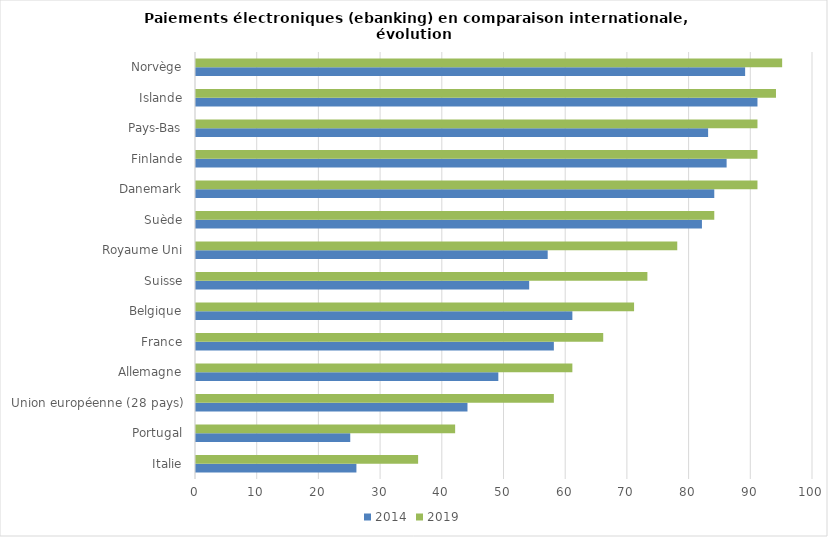
| Category | 2014 | 2019 |
|---|---|---|
| Italie | 26 | 36 |
| Portugal | 25 | 42 |
| Union européenne (28 pays) | 44 | 58 |
| Allemagne | 49 | 61 |
| France | 58 | 66 |
| Belgique | 61 | 71 |
| Suisse | 54 | 73.16 |
| Royaume Uni | 57 | 78 |
| Suède | 82 | 84 |
| Danemark | 84 | 91 |
| Finlande | 86 | 91 |
| Pays-Bas | 83 | 91 |
| Islande | 91 | 94 |
| Norvège | 89 | 95 |